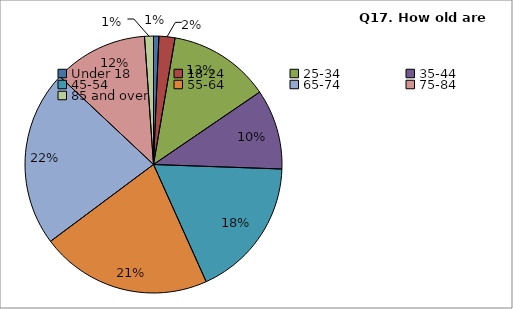
| Category | Series 0 |
|---|---|
| Under 18 | 3 |
| 18-24 | 9 |
| 25-34 | 57 |
| 35-44 | 45 |
| 45-54 | 79 |
| 55-64 | 96 |
| 65-74 | 99 |
| 75-84 | 53 |
| 85 and over | 5 |